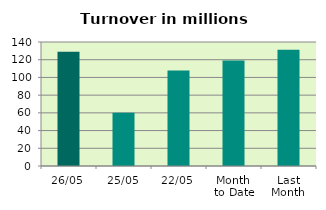
| Category | Series 0 |
|---|---|
| 26/05 | 129.132 |
| 25/05 | 60.164 |
| 22/05 | 107.752 |
| Month 
to Date | 119.206 |
| Last
Month | 131.238 |